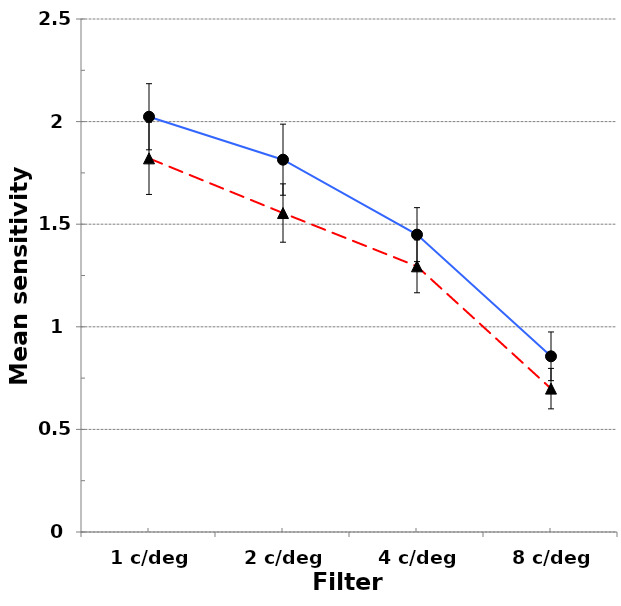
| Category | Low Unusual Experiences score | High Unusual Experiences score |
|---|---|---|
| 1 c/deg | 2.024 | 1.821 |
| 2 c/deg | 1.814 | 1.554 |
| 4 c/deg | 1.449 | 1.295 |
| 8 c/deg | 0.856 | 0.699 |